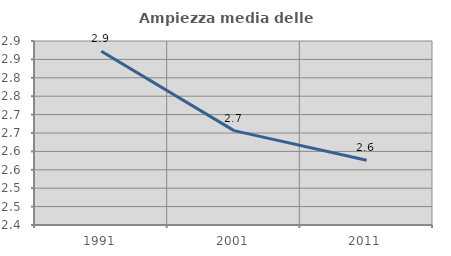
| Category | Ampiezza media delle famiglie |
|---|---|
| 1991.0 | 2.872 |
| 2001.0 | 2.657 |
| 2011.0 | 2.576 |